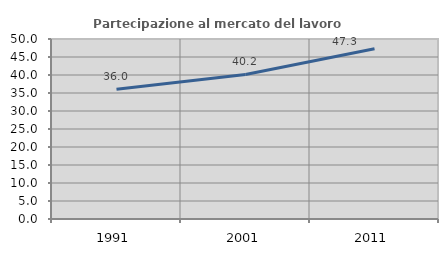
| Category | Partecipazione al mercato del lavoro  femminile |
|---|---|
| 1991.0 | 36.016 |
| 2001.0 | 40.164 |
| 2011.0 | 47.3 |